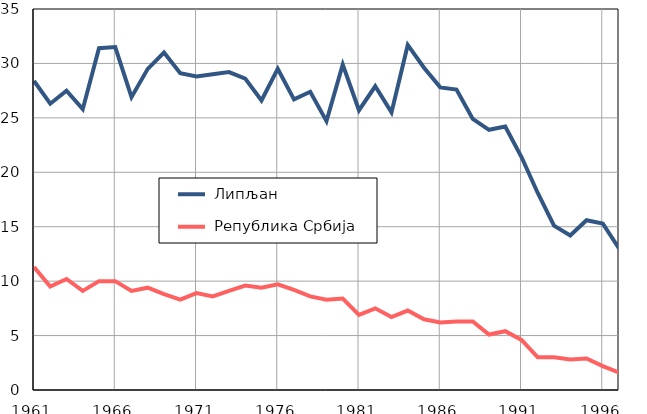
| Category |  Липљан |  Република Србија |
|---|---|---|
| 1961.0 | 28.4 | 11.3 |
| 1962.0 | 26.3 | 9.5 |
| 1963.0 | 27.5 | 10.2 |
| 1964.0 | 25.8 | 9.1 |
| 1965.0 | 31.4 | 10 |
| 1966.0 | 31.5 | 10 |
| 1967.0 | 26.9 | 9.1 |
| 1968.0 | 29.5 | 9.4 |
| 1969.0 | 31 | 8.8 |
| 1970.0 | 29.1 | 8.3 |
| 1971.0 | 28.8 | 8.9 |
| 1972.0 | 29 | 8.6 |
| 1973.0 | 29.2 | 9.1 |
| 1974.0 | 28.6 | 9.6 |
| 1975.0 | 26.6 | 9.4 |
| 1976.0 | 29.5 | 9.7 |
| 1977.0 | 26.7 | 9.2 |
| 1978.0 | 27.4 | 8.6 |
| 1979.0 | 24.7 | 8.3 |
| 1980.0 | 29.9 | 8.4 |
| 1981.0 | 25.7 | 6.9 |
| 1982.0 | 27.9 | 7.5 |
| 1983.0 | 25.5 | 6.7 |
| 1984.0 | 31.7 | 7.3 |
| 1985.0 | 29.6 | 6.5 |
| 1986.0 | 27.8 | 6.2 |
| 1987.0 | 27.6 | 6.3 |
| 1988.0 | 24.9 | 6.3 |
| 1989.0 | 23.9 | 5.1 |
| 1990.0 | 24.2 | 5.4 |
| 1991.0 | 21.4 | 4.6 |
| 1992.0 | 18.1 | 3 |
| 1993.0 | 15.1 | 3 |
| 1994.0 | 14.2 | 2.8 |
| 1995.0 | 15.6 | 2.9 |
| 1996.0 | 15.3 | 2.2 |
| 1997.0 | 13 | 1.6 |